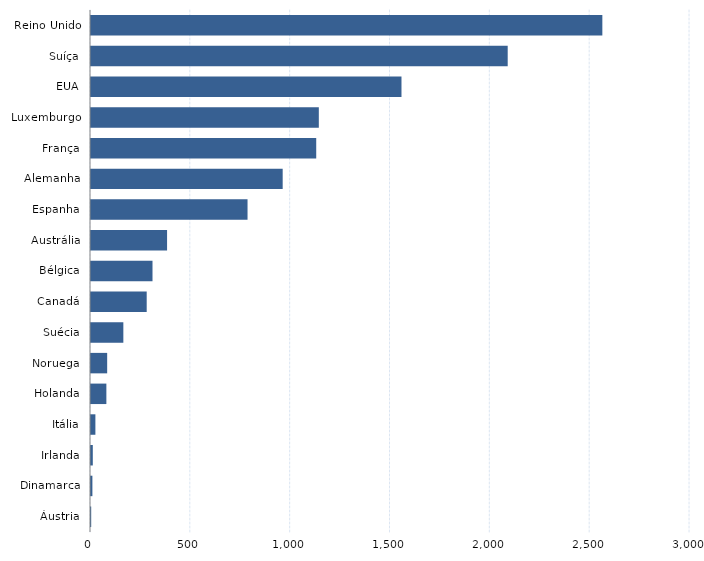
| Category | Series 0 |
|---|---|
| Áustria | 1 |
| Dinamarca | 7 |
| Irlanda | 9 |
| Itália | 22 |
| Holanda | 77 |
| Noruega | 81 |
| Suécia | 162 |
| Canadá | 279 |
| Bélgica | 308 |
| Austrália | 381 |
| Espanha | 784 |
| Alemanha | 960 |
| França | 1128 |
| Luxemburgo | 1141 |
| EUA | 1555 |
| Suíça | 2087 |
| Reino Unido | 2561 |